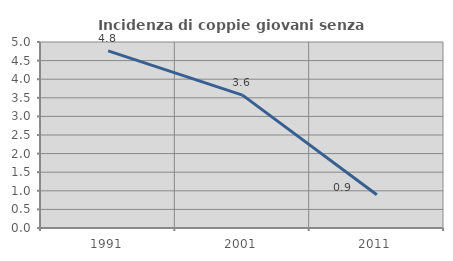
| Category | Incidenza di coppie giovani senza figli |
|---|---|
| 1991.0 | 4.762 |
| 2001.0 | 3.571 |
| 2011.0 | 0.893 |